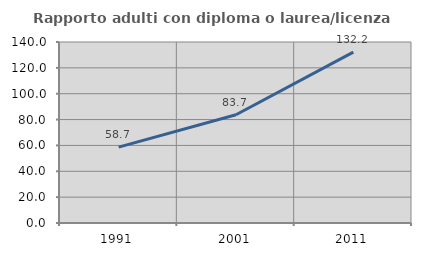
| Category | Rapporto adulti con diploma o laurea/licenza media  |
|---|---|
| 1991.0 | 58.71 |
| 2001.0 | 83.732 |
| 2011.0 | 132.189 |